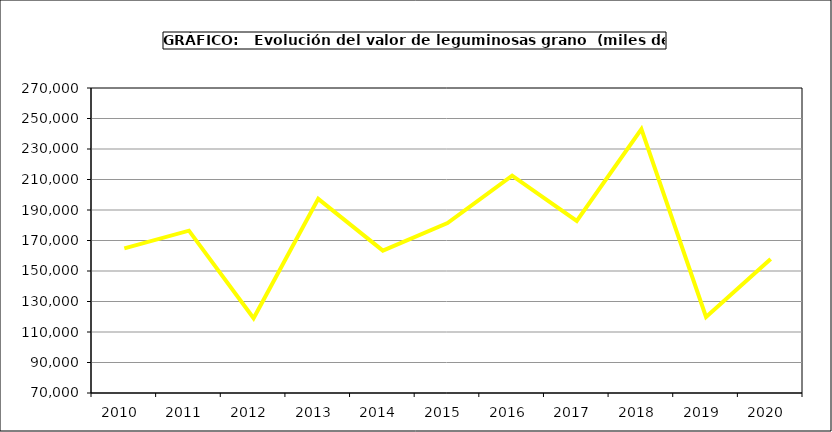
| Category | Valor |
|---|---|
| 2010.0 | 164853 |
| 2011.0 | 176441 |
| 2012.0 | 119054.324 |
| 2013.0 | 197282.867 |
| 2014.0 | 163368.079 |
| 2015.0 | 181398 |
| 2016.0 | 212486.887 |
| 2017.0 | 182785.866 |
| 2018.0 | 243011.339 |
| 2019.0 | 119896.726 |
| 2020.0 | 157795.694 |